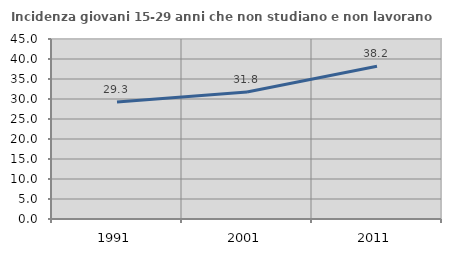
| Category | Incidenza giovani 15-29 anni che non studiano e non lavorano  |
|---|---|
| 1991.0 | 29.28 |
| 2001.0 | 31.757 |
| 2011.0 | 38.168 |